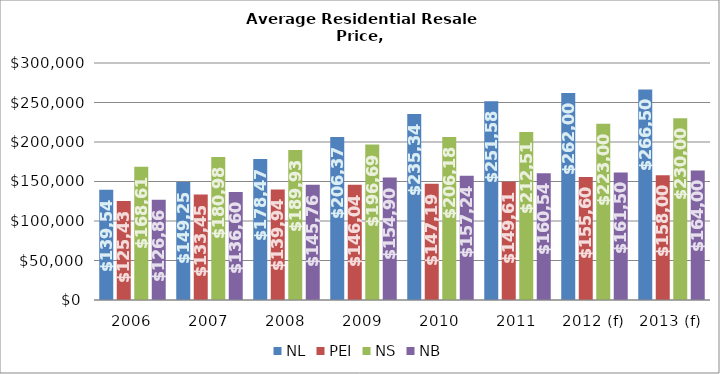
| Category | NL | PEI | NS | NB |
|---|---|---|---|---|
| 2006 | 139542 | 125430 | 168614 | 126864 |
| 2007 | 149258 | 133457 | 180989 | 136603 |
| 2008 | 178477 | 139944 | 189932 | 145762 |
| 2009 | 206374 | 146044 | 196690 | 154906 |
| 2010 | 235341 | 147196 | 206186 | 157240 |
| 2011 | 251581 | 149617 | 212512 | 160545 |
| 2012 (f) | 262000 | 155600 | 223000 | 161500 |
| 2013 (f) | 266500 | 158000 | 230000 | 164000 |